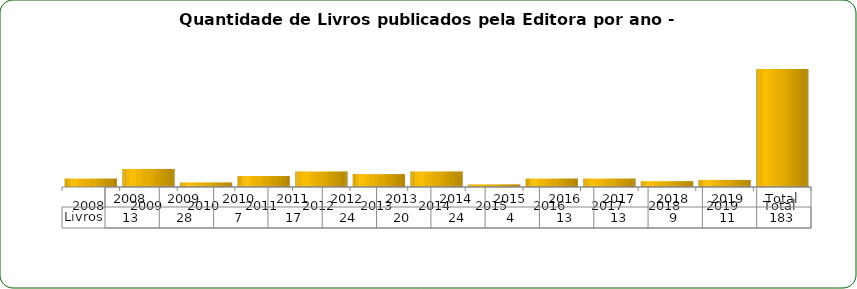
| Category | Livros |
|---|---|
| 2008 | 13 |
| 2009 | 28 |
| 2010 | 7 |
| 2011 | 17 |
| 2012 | 24 |
| 2013 | 20 |
| 2014 | 24 |
| 2015 | 4 |
| 2016 | 13 |
| 2017 | 13 |
| 2018 | 9 |
| 2019 | 11 |
| Total | 183 |